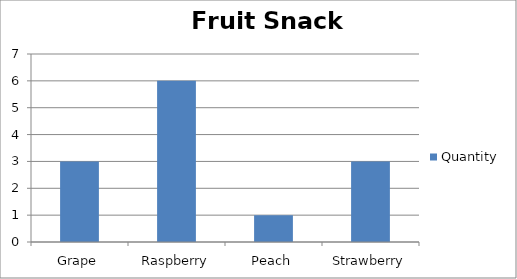
| Category | Quantity |
|---|---|
| Grape | 3 |
| Raspberry | 6 |
| Peach | 1 |
| Strawberry | 3 |